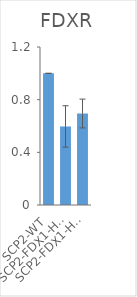
| Category | FDXR |
|---|---|
| SCP2-WT | 1 |
| SCP2-FDX1-Het-1 | 0.597 |
| SCP2-FDX1-Het-2 | 0.695 |